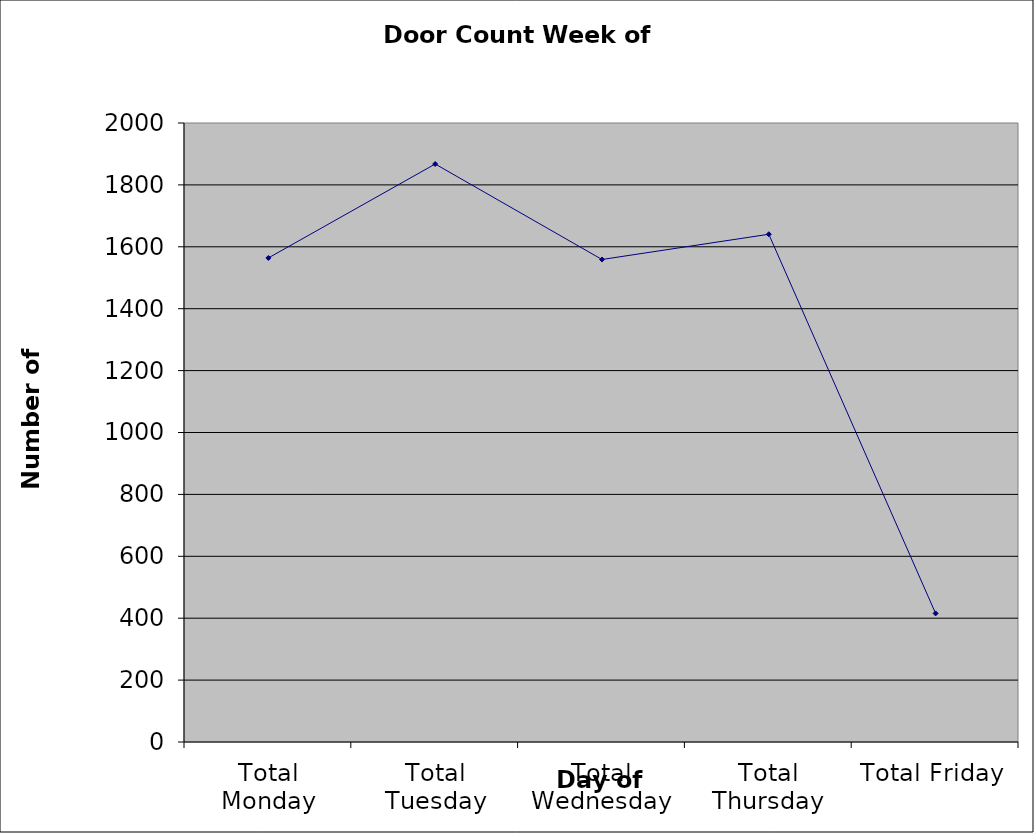
| Category | Series 0 |
|---|---|
| Total Monday | 1564 |
| Total Tuesday | 1867.5 |
| Total Wednesday | 1559 |
| Total Thursday | 1640.5 |
| Total Friday | 415.5 |